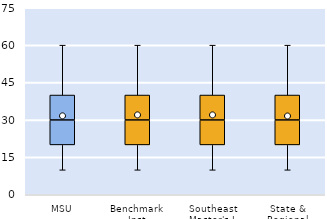
| Category | 25th | 50th | 75th |
|---|---|---|---|
| MSU | 20 | 10 | 10 |
| Benchmark Inst | 20 | 10 | 10 |
| Southeast Master's-L | 20 | 10 | 10 |
| State & Regional | 20 | 10 | 10 |